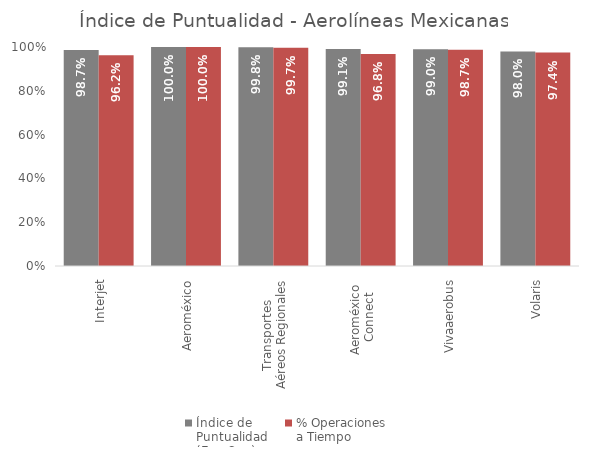
| Category | Índice de 
Puntualidad
(Ene-Sep) | % Operaciones 
a Tiempo |
|---|---|---|
| Interjet | 0.987 | 0.962 |
| Aeroméxico | 1 | 1 |
| Transportes 
Aéreos Regionales | 0.998 | 0.997 |
| Aeroméxico 
Connect | 0.991 | 0.968 |
| Vivaaerobus | 0.99 | 0.987 |
| Volaris | 0.98 | 0.974 |